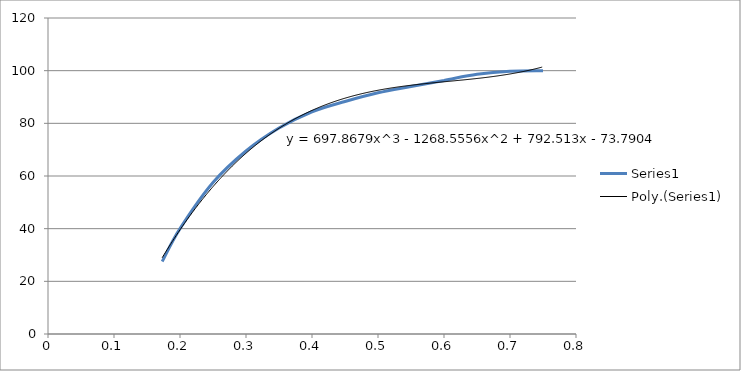
| Category | Series 0 |
|---|---|
| 0.173 | 27.5 |
| 0.2 | 40 |
| 0.25 | 57.5 |
| 0.3 | 69.5 |
| 0.35 | 78.2 |
| 0.4 | 84.4 |
| 0.45 | 88.3 |
| 0.5 | 91.6 |
| 0.55 | 94 |
| 0.6 | 96.3 |
| 0.65 | 98.6 |
| 0.7 | 99.8 |
| 0.75 | 100 |